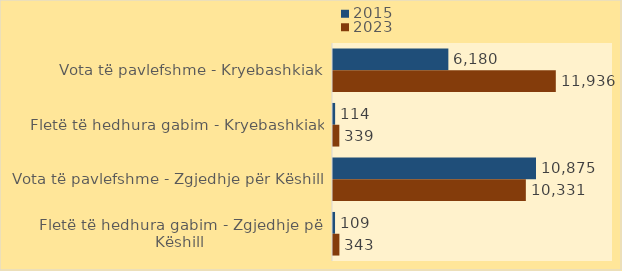
| Category | 2015 | 2023 |
|---|---|---|
| Vota të pavlefshme - Kryebashkiak | 6180 | 11936 |
| Fletë të hedhura gabim - Kryebashkiak | 114 | 339 |
| Vota të pavlefshme - Zgjedhje për Këshill | 10875 | 10331 |
| Fletë të hedhura gabim - Zgjedhje për Këshill | 109 | 343 |